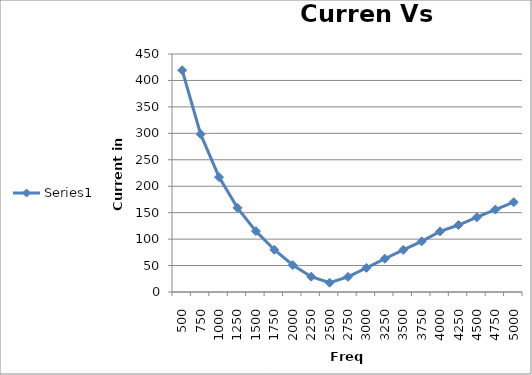
| Category | Series 0 |
|---|---|
| 500.0 | 419.3 |
| 750.0 | 298.5 |
| 1000.0 | 217.23 |
| 1250.0 | 159.18 |
| 1500.0 | 115.08 |
| 1750.0 | 79.87 |
| 2000.0 | 51 |
| 2250.0 | 28.93 |
| 2500.0 | 17.52 |
| 2750.0 | 28.55 |
| 3000.0 | 45.6 |
| 3250.0 | 62.884 |
| 3500.0 | 79.66 |
| 3750.0 | 95.83 |
| 4000.0 | 114.47 |
| 4250.0 | 126.63 |
| 4500.0 | 141.39 |
| 4750.0 | 155.79 |
| 5000.0 | 169.89 |